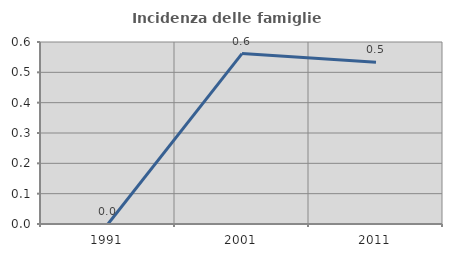
| Category | Incidenza delle famiglie numerose |
|---|---|
| 1991.0 | 0 |
| 2001.0 | 0.562 |
| 2011.0 | 0.533 |